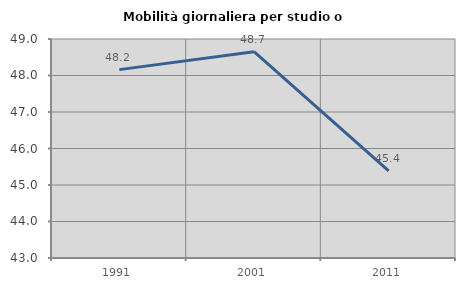
| Category | Mobilità giornaliera per studio o lavoro |
|---|---|
| 1991.0 | 48.161 |
| 2001.0 | 48.651 |
| 2011.0 | 45.389 |